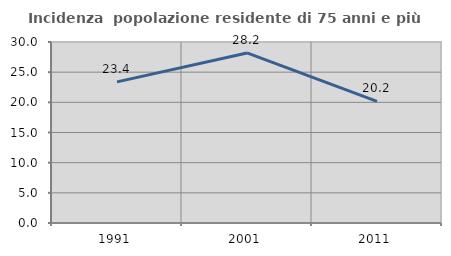
| Category | Incidenza  popolazione residente di 75 anni e più |
|---|---|
| 1991.0 | 23.392 |
| 2001.0 | 28.188 |
| 2011.0 | 20.161 |